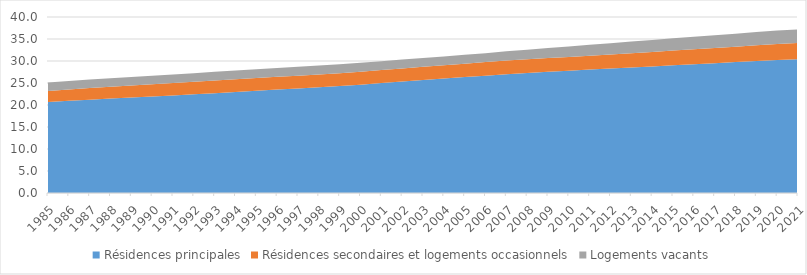
| Category | Résidences principales | Résidences secondaires et logements occasionnels | Logements vacants |
|---|---|---|---|
| 1985.0 | 20.699 | 2.495 | 1.919 |
| 1986.0 | 20.964 | 2.567 | 1.925 |
| 1987.0 | 21.219 | 2.636 | 1.929 |
| 1988.0 | 21.459 | 2.703 | 1.932 |
| 1989.0 | 21.682 | 2.767 | 1.932 |
| 1990.0 | 21.91 | 2.818 | 1.935 |
| 1991.0 | 22.163 | 2.842 | 1.945 |
| 1992.0 | 22.428 | 2.853 | 1.959 |
| 1993.0 | 22.694 | 2.864 | 1.973 |
| 1994.0 | 22.961 | 2.874 | 1.987 |
| 1995.0 | 23.234 | 2.885 | 2.001 |
| 1996.0 | 23.506 | 2.895 | 2.015 |
| 1997.0 | 23.772 | 2.904 | 2.028 |
| 1998.0 | 24.035 | 2.912 | 2.04 |
| 1999.0 | 24.294 | 2.92 | 2.052 |
| 2000.0 | 24.628 | 2.938 | 2.048 |
| 2001.0 | 24.972 | 2.954 | 2.045 |
| 2002.0 | 25.326 | 2.97 | 2.022 |
| 2003.0 | 25.676 | 2.992 | 2.001 |
| 2004.0 | 26.016 | 3.018 | 1.997 |
| 2005.0 | 26.353 | 3.049 | 1.993 |
| 2006.0 | 26.672 | 3.09 | 2.023 |
| 2007.0 | 26.993 | 3.108 | 2.089 |
| 2008.0 | 27.271 | 3.127 | 2.182 |
| 2009.0 | 27.534 | 3.128 | 2.29 |
| 2010.0 | 27.786 | 3.139 | 2.389 |
| 2011.0 | 28.041 | 3.157 | 2.474 |
| 2012.0 | 28.269 | 3.196 | 2.573 |
| 2013.0 | 28.516 | 3.232 | 2.667 |
| 2014.0 | 28.766 | 3.287 | 2.748 |
| 2015.0 | 29.012 | 3.347 | 2.823 |
| 2016.0 | 29.237 | 3.407 | 2.891 |
| 2017.0 | 29.48 | 3.465 | 2.935 |
| 2018.0 | 29.752 | 3.514 | 2.954 |
| 2019.0 | 30.005 | 3.571 | 3 |
| 2020.0 | 30.25 | 3.628 | 3.045 |
| 2021.0 | 30.434 | 3.678 | 3.085 |